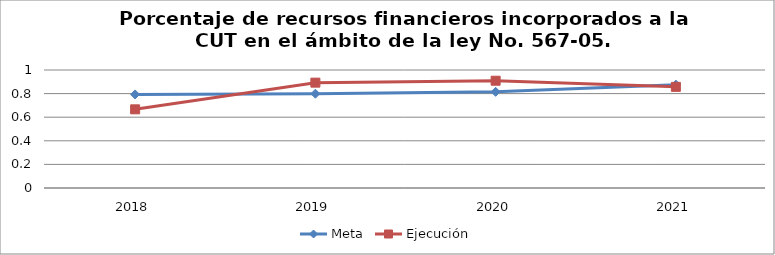
| Category | Meta | Ejecución |
|---|---|---|
| 2018.0 | 0.793 | 0.667 |
| 2019.0 | 0.799 | 0.893 |
| 2020.0 | 0.815 | 0.909 |
| 2021.0 | 0.876 | 0.857 |